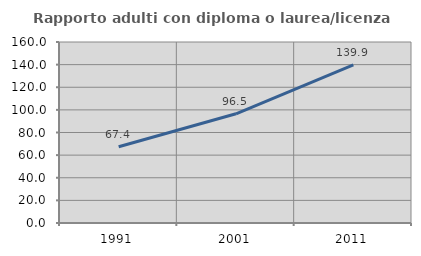
| Category | Rapporto adulti con diploma o laurea/licenza media  |
|---|---|
| 1991.0 | 67.391 |
| 2001.0 | 96.53 |
| 2011.0 | 139.877 |